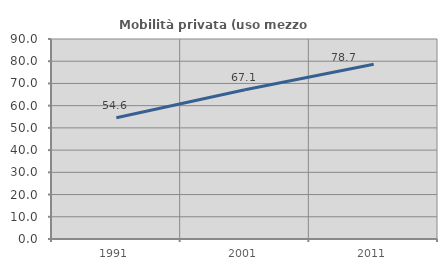
| Category | Mobilità privata (uso mezzo privato) |
|---|---|
| 1991.0 | 54.561 |
| 2001.0 | 67.136 |
| 2011.0 | 78.666 |